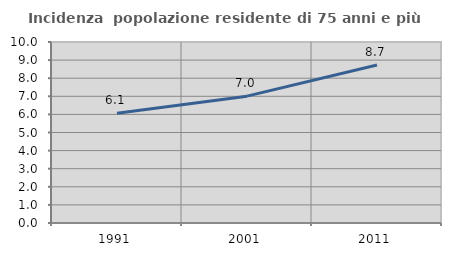
| Category | Incidenza  popolazione residente di 75 anni e più |
|---|---|
| 1991.0 | 6.063 |
| 2001.0 | 7.008 |
| 2011.0 | 8.728 |